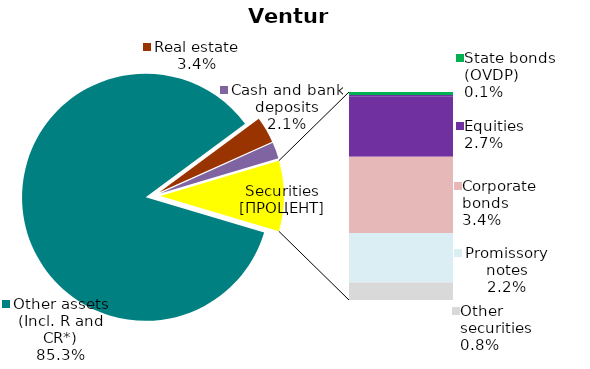
| Category | Series 0 |
|---|---|
| Other assets (Incl. R and CR*) | 0.853 |
| Real estate | 0.034 |
| Cash and bank deposits | 0.021 |
| Bank metals | 0 |
| State bonds (OVDP) | 0.001 |
| Municipal bonds | 0.001 |
| Equities | 0.027 |
| Corporate bonds | 0.034 |
| Promissory notes | 0.022 |
| Other securities | 0.008 |